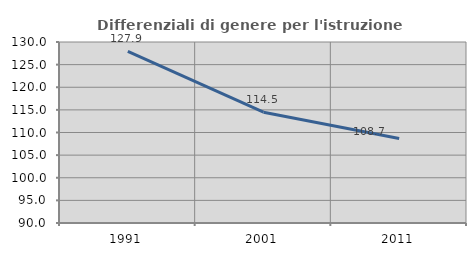
| Category | Differenziali di genere per l'istruzione superiore |
|---|---|
| 1991.0 | 127.939 |
| 2001.0 | 114.486 |
| 2011.0 | 108.657 |